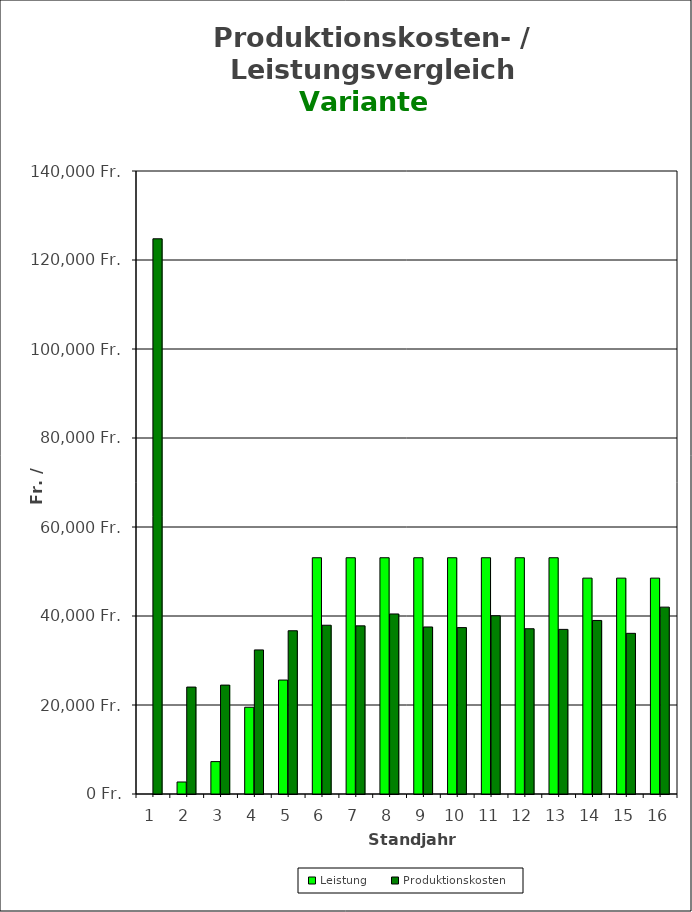
| Category | Leistung | Produktionskosten |
|---|---|---|
| 0 | 0 | 124765.916 |
| 1 | 2700 | 24030.357 |
| 2 | 7281.044 | 24473.284 |
| 3 | 19497.161 | 32375.372 |
| 4 | 25605.22 | 36682.232 |
| 5 | 53091.483 | 37921.699 |
| 6 | 53091.483 | 37785.171 |
| 7 | 53091.483 | 40457.618 |
| 8 | 53091.483 | 37533.71 |
| 9 | 53091.483 | 37393.69 |
| 10 | 53091.483 | 40062.613 |
| 11 | 53091.483 | 37135.15 |
| 12 | 53091.483 | 36991.543 |
| 13 | 48510.439 | 38998.517 |
| 14 | 48510.439 | 36102.706 |
| 15 | 48510.439 | 41991.037 |